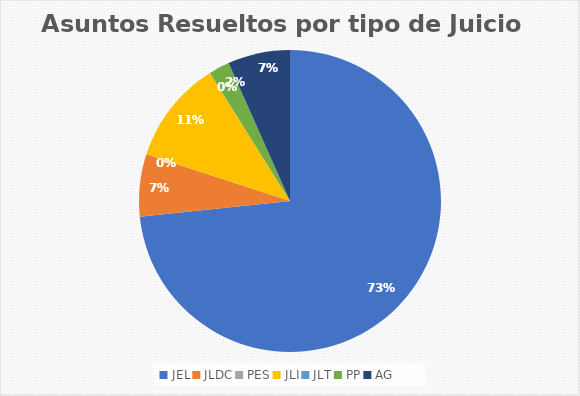
| Category | Asuntos Resueltos por tipo de Juicio  Julio |
|---|---|
| JEL | 33 |
| JLDC | 3 |
| PES | 0 |
| JLI | 5 |
| JLT | 0 |
| PP | 1 |
| AG | 3 |